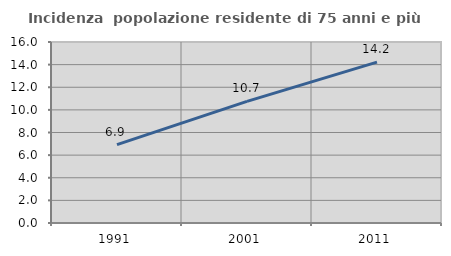
| Category | Incidenza  popolazione residente di 75 anni e più |
|---|---|
| 1991.0 | 6.925 |
| 2001.0 | 10.748 |
| 2011.0 | 14.221 |